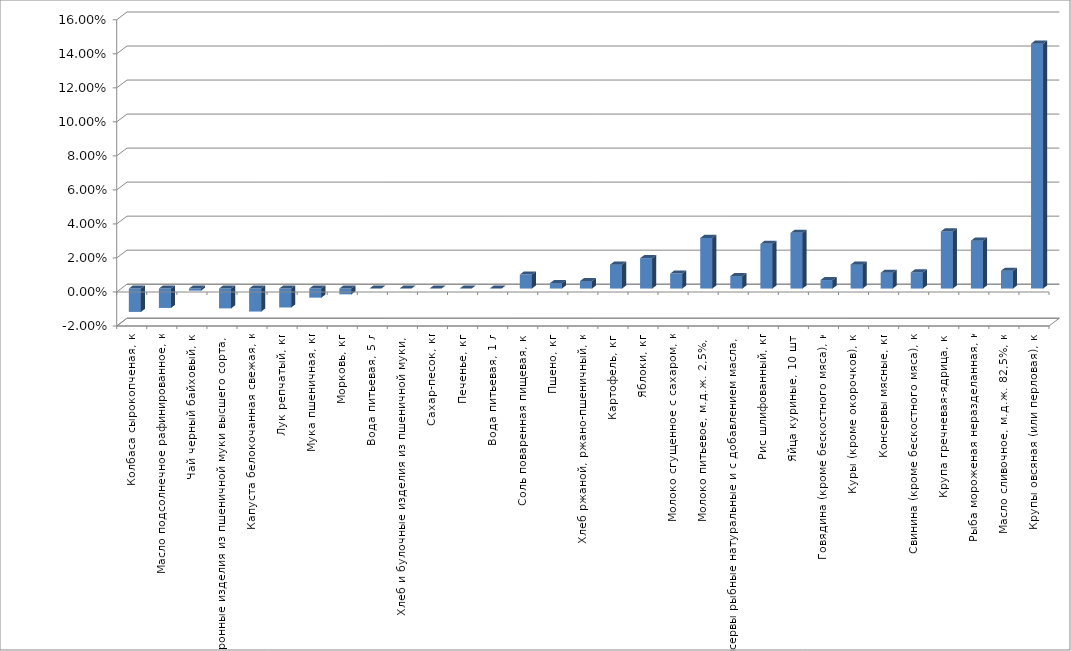
| Category | Series 0 |
|---|---|
| Колбаса сырокопченая, кг | -0.014 |
| Масло подсолнечное рафинированное, кг | -0.011 |
| Чай черный байховый, кг | -0.001 |
| Макаронные изделия из пшеничной муки высшего сорта, кг | -0.012 |
| Капуста белокочанная свежая, кг | -0.014 |
| Лук репчатый, кг | -0.011 |
| Мука пшеничная, кг | -0.005 |
| Морковь, кг | -0.003 |
| Вода питьевая, 5 л | 0 |
| Хлеб и булочные изделия из пшеничной муки, кг | 0 |
| Сахар-песок, кг | 0 |
| Печенье, кг | 0 |
| Вода питьевая, 1 л | 0 |
| Соль поваренная пищевая, кг | 0.008 |
| Пшено, кг | 0.003 |
| Хлеб ржаной, ржано-пшеничный, кг | 0.004 |
| Картофель, кг | 0.014 |
| Яблоки, кг | 0.018 |
| Молоко сгущенное с сахаром, кг | 0.009 |
| Молоко питьевое, м.д.ж. 2,5%, л | 0.03 |
| Консервы рыбные натуральные и с добавлением масла, кг | 0.007 |
| Рис шлифованный, кг | 0.026 |
| Яйца куриные, 10 шт. | 0.033 |
| Говядина (кроме бескостного мяса), кг | 0.005 |
| Куры (кроме окорочков), кг | 0.014 |
| Консервы мясные, кг | 0.009 |
| Свинина (кроме бескостного мяса), кг | 0.009 |
| Крупа гречневая-ядрица, кг | 0.034 |
| Рыба мороженая неразделанная, кг | 0.028 |
| Масло сливочное, м.д.ж. 82,5%, кг | 0.01 |
| Крупы овсяная (или перловая), кг | 0.144 |